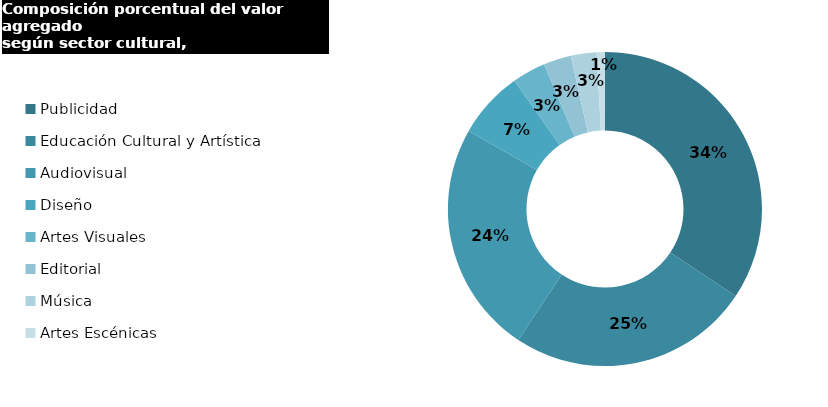
| Category | SECTORES |
|---|---|
| Publicidad | 265360.357 |
| Educación Cultural y Artística | 192827.499 |
| Audiovisual | 185197.834 |
| Diseño | 53537.858 |
| Artes Visuales | 26706.505 |
| Editorial | 21933.126 |
| Música | 20508.505 |
| Artes Escénicas | 6514.405 |